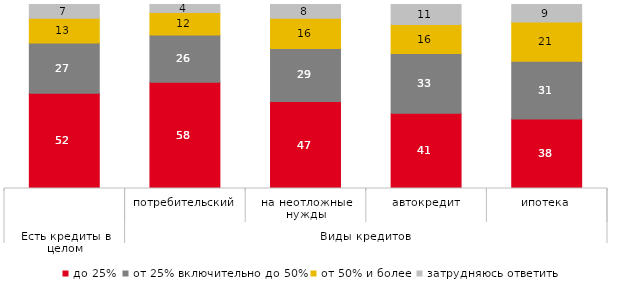
| Category | до 25% | от 25% включительно до 50% | от 50% и более | затрудняюсь ответить |
|---|---|---|---|---|
| 0 | 51.716 | 27.337 | 13.491 | 7.456 |
| 1 | 57.721 | 25.735 | 12.132 | 4.412 |
| 2 | 47.28 | 28.87 | 16.318 | 7.531 |
| 3 | 40.833 | 32.5 | 15.833 | 10.833 |
| 4 | 37.811 | 31.343 | 21.393 | 9.453 |